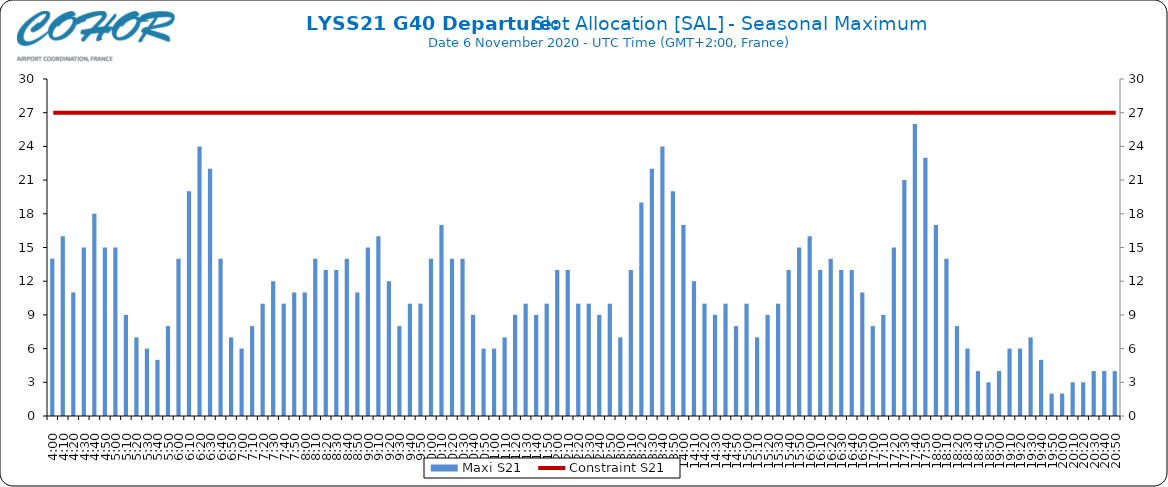
| Category | Maxi S21 |
|---|---|
| 0.16666666666666666 | 14 |
| 0.17361111111111113 | 16 |
| 0.18055555555555555 | 11 |
| 0.1875 | 15 |
| 0.19444444444444445 | 18 |
| 0.20138888888888887 | 15 |
| 0.20833333333333334 | 15 |
| 0.2152777777777778 | 9 |
| 0.2222222222222222 | 7 |
| 0.22916666666666666 | 6 |
| 0.23611111111111113 | 5 |
| 0.24305555555555555 | 8 |
| 0.25 | 14 |
| 0.2569444444444445 | 20 |
| 0.2638888888888889 | 24 |
| 0.2708333333333333 | 22 |
| 0.2777777777777778 | 14 |
| 0.2847222222222222 | 7 |
| 0.2916666666666667 | 6 |
| 0.2986111111111111 | 8 |
| 0.3055555555555555 | 10 |
| 0.3125 | 12 |
| 0.3194444444444445 | 10 |
| 0.3263888888888889 | 11 |
| 0.3333333333333333 | 11 |
| 0.34027777777777773 | 14 |
| 0.34722222222222227 | 13 |
| 0.3541666666666667 | 13 |
| 0.3611111111111111 | 14 |
| 0.3680555555555556 | 11 |
| 0.375 | 15 |
| 0.3819444444444444 | 16 |
| 0.3888888888888889 | 12 |
| 0.3958333333333333 | 8 |
| 0.40277777777777773 | 10 |
| 0.40972222222222227 | 10 |
| 0.4166666666666667 | 14 |
| 0.4236111111111111 | 17 |
| 0.4305555555555556 | 14 |
| 0.4375 | 14 |
| 0.4444444444444444 | 9 |
| 0.4513888888888889 | 6 |
| 0.4583333333333333 | 6 |
| 0.46527777777777773 | 7 |
| 0.47222222222222227 | 9 |
| 0.4791666666666667 | 10 |
| 0.4861111111111111 | 9 |
| 0.4930555555555556 | 10 |
| 0.5 | 13 |
| 0.5069444444444444 | 13 |
| 0.513888888888889 | 10 |
| 0.5208333333333334 | 10 |
| 0.5277777777777778 | 9 |
| 0.5347222222222222 | 10 |
| 0.5416666666666666 | 7 |
| 0.548611111111111 | 13 |
| 0.5555555555555556 | 19 |
| 0.5625 | 22 |
| 0.5694444444444444 | 24 |
| 0.576388888888889 | 20 |
| 0.5833333333333334 | 17 |
| 0.5902777777777778 | 12 |
| 0.5972222222222222 | 10 |
| 0.6041666666666666 | 9 |
| 0.611111111111111 | 10 |
| 0.6180555555555556 | 8 |
| 0.625 | 10 |
| 0.6319444444444444 | 7 |
| 0.638888888888889 | 9 |
| 0.6458333333333334 | 10 |
| 0.6527777777777778 | 13 |
| 0.6597222222222222 | 15 |
| 0.6666666666666666 | 16 |
| 0.6736111111111112 | 13 |
| 0.6805555555555555 | 14 |
| 0.6875 | 13 |
| 0.6944444444444445 | 13 |
| 0.7013888888888888 | 11 |
| 0.7083333333333334 | 8 |
| 0.7152777777777778 | 9 |
| 0.7222222222222222 | 15 |
| 0.7291666666666666 | 21 |
| 0.7361111111111112 | 26 |
| 0.7430555555555555 | 23 |
| 0.75 | 17 |
| 0.7569444444444445 | 14 |
| 0.7638888888888888 | 8 |
| 0.7708333333333334 | 6 |
| 0.7777777777777778 | 4 |
| 0.7847222222222222 | 3 |
| 0.7916666666666666 | 4 |
| 0.7986111111111112 | 6 |
| 0.8055555555555555 | 6 |
| 0.8125 | 7 |
| 0.8194444444444445 | 5 |
| 0.8263888888888888 | 2 |
| 0.8333333333333334 | 2 |
| 0.8402777777777778 | 3 |
| 0.8472222222222222 | 3 |
| 0.8541666666666666 | 4 |
| 0.8611111111111112 | 4 |
| 0.8680555555555555 | 4 |